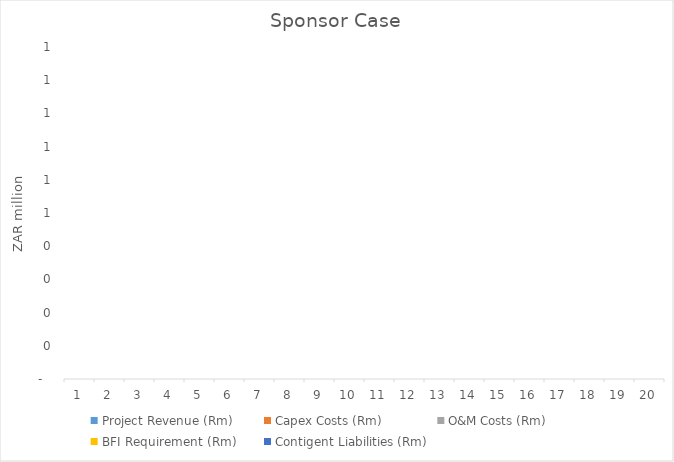
| Category | Project Revenue (Rm) | Capex Costs (Rm) | O&M Costs (Rm) | BFI Requirement (Rm) | Contigent Liabilities (Rm) |
|---|---|---|---|---|---|
| 0 | 0 | 0 | 0 | 0 | 0 |
| 1 | 0 | 0 | 0 | 0 | 0 |
| 2 | 0 | 0 | 0 | 0 | 0 |
| 3 | 0 | 0 | 0 | 0 | 0 |
| 4 | 0 | 0 | 0 | 0 | 0 |
| 5 | 0 | 0 | 0 | 0 | 0 |
| 6 | 0 | 0 | 0 | 0 | 0 |
| 7 | 0 | 0 | 0 | 0 | 0 |
| 8 | 0 | 0 | 0 | 0 | 0 |
| 9 | 0 | 0 | 0 | 0 | 0 |
| 10 | 0 | 0 | 0 | 0 | 0 |
| 11 | 0 | 0 | 0 | 0 | 0 |
| 12 | 0 | 0 | 0 | 0 | 0 |
| 13 | 0 | 0 | 0 | 0 | 0 |
| 14 | 0 | 0 | 0 | 0 | 0 |
| 15 | 0 | 0 | 0 | 0 | 0 |
| 16 | 0 | 0 | 0 | 0 | 0 |
| 17 | 0 | 0 | 0 | 0 | 0 |
| 18 | 0 | 0 | 0 | 0 | 0 |
| 19 | 0 | 0 | 0 | 0 | 0 |